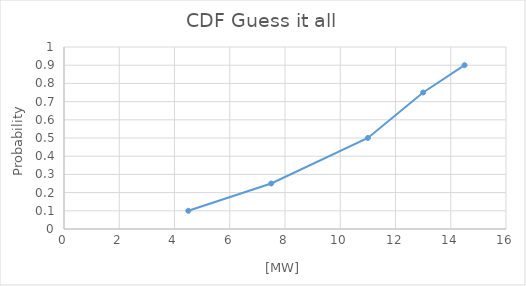
| Category | Actual frequency in percentage |
|---|---|
| 4.5 | 0.1 |
| 7.5 | 0.25 |
| 11.0 | 0.5 |
| 13.0 | 0.75 |
| 14.5 | 0.9 |